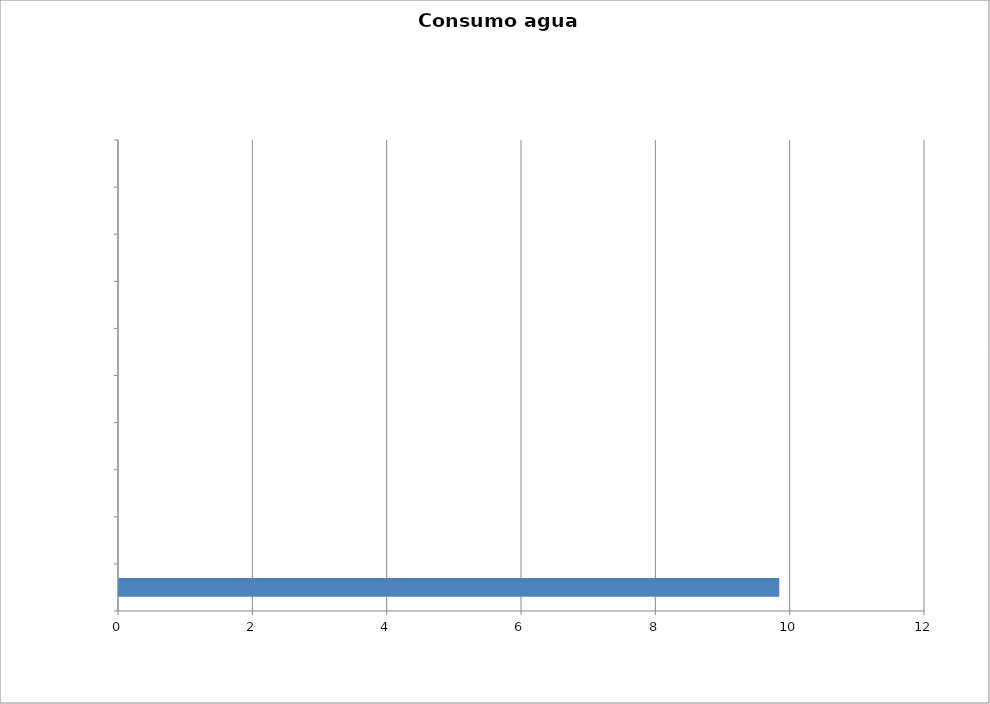
| Category | Series 0 |
|---|---|
| 0 | 9.831 |
| 1 | 0 |
| 2 | 0 |
| 3 | 0 |
| 4 | 0 |
| 5 | 0 |
| 6 | 0 |
| 7 | 0 |
| 8 | 0 |
| 9 | 0 |